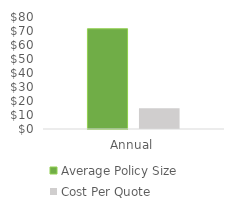
| Category | Average Policy Size | Cost Per Quote |
|---|---|---|
| Annual | 71.605 | 14.833 |